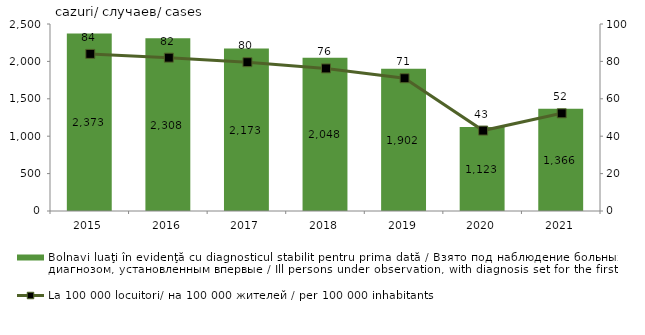
| Category | Bolnavi luaţi în evidenţă cu diagnosticul stabilit pentru prima dată / Bзято под наблюдение больных с диагнозом, установленным впервые / Ill persons under observation, with diagnosis set for the first time |
|---|---|
| 2015.0 | 2373 |
| 2016.0 | 2308 |
| 2017.0 | 2173 |
| 2018.0 | 2048 |
| 2019.0 | 1902 |
| 2020.0 | 1123 |
| 2021.0 | 1366 |